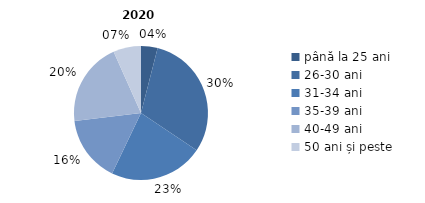
| Category | 2020 |
|---|---|
| până la 25 ani | 4 |
| 26-30 ani | 30.4 |
| 31-34 ani | 22.7 |
| 35-39 ani | 16 |
| 40-49 ani | 20.2 |
| 50 ani și peste | 6.7 |